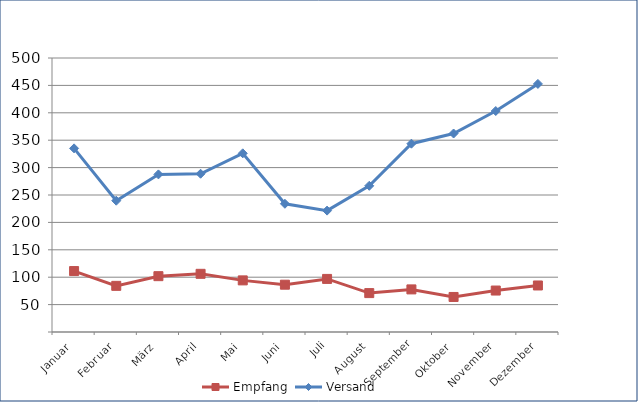
| Category | Empfang | Versand |
|---|---|---|
| Januar | 111.21 | 335.123 |
| Februar | 84.22 | 239.579 |
| März | 101.877 | 287.605 |
| April | 106.173 | 288.786 |
| Mai | 94.185 | 326.067 |
| Juni | 86.312 | 234.001 |
| Juli | 96.863 | 221.496 |
| August | 70.989 | 266.801 |
| September | 77.733 | 343.639 |
| Oktober | 63.941 | 362.202 |
| November | 75.65 | 403.272 |
| Dezember | 84.884 | 452.686 |